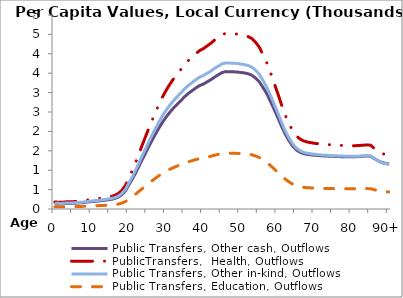
| Category | Public Transfers, Other cash, Outflows | PublicTransfers,  Health, Outflows | Public Transfers, Other in-kind, Outflows | Public Transfers, Education, Outflows |
|---|---|---|---|---|
| 0 | 139.032 | 180.778 | 150.455 | 57.532 |
|  | 134.147 | 174.426 | 145.168 | 55.51 |
| 2 | 133.057 | 173.009 | 143.989 | 55.059 |
| 3 | 141.717 | 184.269 | 153.36 | 58.643 |
| 4 | 142.704 | 185.553 | 154.428 | 59.051 |
| 5 | 146.32 | 190.254 | 158.341 | 60.547 |
| 6 | 152.817 | 198.701 | 165.372 | 63.236 |
| 7 | 159.899 | 207.911 | 173.036 | 66.167 |
| 8 | 169.314 | 220.152 | 183.224 | 70.062 |
| 9 | 182.772 | 237.651 | 197.788 | 75.631 |
| 10 | 191.481 | 248.976 | 207.213 | 79.235 |
| 11 | 200.473 | 260.667 | 216.943 | 82.956 |
| 12 | 209.949 | 272.989 | 227.198 | 86.877 |
| 13 | 220.743 | 287.023 | 238.878 | 91.344 |
| 14 | 232.007 | 301.67 | 251.069 | 96.005 |
| 15 | 246.599 | 320.643 | 266.859 | 102.043 |
| 16 | 266.409 | 346.401 | 288.296 | 110.24 |
| 17 | 302.263 | 393.02 | 327.096 | 125.077 |
| 18 | 366.175 | 476.124 | 396.259 | 151.524 |
| 19 | 466.312 | 606.328 | 504.623 | 192.961 |
| 20 | 633.241 | 817.873 | 680.684 | 260.284 |
| 21 | 794.212 | 1026.357 | 854.197 | 326.632 |
| 22 | 976.889 | 1262.941 | 1051.097 | 401.924 |
| 23 | 1174.708 | 1519.054 | 1264.25 | 483.431 |
| 24 | 1364.932 | 1765.088 | 1469.015 | 561.73 |
| 25 | 1553.705 | 2009.042 | 1672.048 | 639.367 |
| 26 | 1739.828 | 2249.276 | 1871.986 | 715.82 |
| 27 | 1915.104 | 2475.023 | 2059.867 | 787.663 |
| 28 | 2083.41 | 2691.517 | 2240.046 | 856.561 |
| 29 | 2238.52 | 2890.779 | 2405.884 | 919.975 |
| 30 | 2375.058 | 3065.386 | 2551.203 | 975.542 |
| 31 | 2498.477 | 3222.581 | 2682.03 | 1025.569 |
| 32 | 2606.732 | 3359.74 | 2796.182 | 1069.219 |
| 33 | 2705.934 | 3484.663 | 2900.151 | 1108.975 |
| 34 | 2801.962 | 3604.952 | 3000.263 | 1147.256 |
| 35 | 2900.164 | 3728.176 | 3102.818 | 1186.472 |
| 36 | 2982.546 | 3831.48 | 3188.794 | 1219.348 |
| 37 | 3051.804 | 3918.983 | 3261.619 | 1247.195 |
| 38 | 3122.511 | 4008.936 | 3336.483 | 1275.822 |
| 39 | 3182.287 | 4084.91 | 3399.714 | 1300.001 |
| 40 | 3221.468 | 4134.223 | 3440.755 | 1315.694 |
| 41 | 3276.887 | 4203.655 | 3498.54 | 1337.79 |
| 42 | 3332.328 | 4271.71 | 3555.18 | 1359.449 |
| 43 | 3399.367 | 4353.798 | 3623.499 | 1385.573 |
| 44 | 3458.143 | 4424.758 | 3682.556 | 1408.155 |
| 45 | 3516.219 | 4495.486 | 3741.42 | 1430.664 |
| 46 | 3541.426 | 4525.037 | 3766.015 | 1440.069 |
| 47 | 3537.642 | 4517.868 | 3760.048 | 1437.787 |
| 48 | 3535.555 | 4513.75 | 3756.621 | 1436.477 |
| 49 | 3531.455 | 4507.925 | 3751.773 | 1434.623 |
| 50 | 3518.347 | 4489.463 | 3736.407 | 1428.747 |
| 51 | 3507.151 | 4472.721 | 3722.474 | 1423.419 |
| 52 | 3486.69 | 4444.6 | 3699.07 | 1414.47 |
| 53 | 3450.327 | 4396.16 | 3658.755 | 1399.054 |
| 54 | 3378.037 | 4300.573 | 3579.202 | 1368.634 |
| 55 | 3284.095 | 4178.063 | 3477.242 | 1329.646 |
| 56 | 3137.094 | 3986.864 | 3318.114 | 1268.798 |
| 57 | 2980.458 | 3783.05 | 3148.487 | 1203.935 |
| 58 | 2785.856 | 3530.429 | 2938.241 | 1123.54 |
| 59 | 2576.256 | 3258.911 | 2712.266 | 1037.131 |
| 60 | 2361.724 | 2980.785 | 2480.793 | 948.619 |
| 61 | 2140.738 | 2694.319 | 2242.378 | 857.452 |
| 62 | 1932.392 | 2424.095 | 2017.481 | 771.455 |
| 63 | 1766.413 | 2207.381 | 1837.119 | 702.487 |
| 64 | 1623.246 | 2019.575 | 1680.815 | 642.719 |
| 65 | 1522.686 | 1885.749 | 1569.437 | 600.129 |
| 66 | 1462.308 | 1803.644 | 1501.104 | 574 |
| 67 | 1427.276 | 1754.733 | 1460.397 | 558.434 |
| 68 | 1407.141 | 1725.629 | 1436.175 | 549.172 |
| 69 | 1395.293 | 1707.794 | 1421.332 | 543.496 |
| 70 | 1385.25 | 1693.172 | 1409.162 | 538.843 |
| 71 | 1377.618 | 1681.723 | 1399.634 | 535.199 |
| 72 | 1370.607 | 1670.882 | 1390.611 | 531.749 |
| 73 | 1365.45 | 1663.152 | 1384.177 | 529.289 |
| 74 | 1360.64 | 1656.081 | 1378.292 | 527.039 |
| 75 | 1356.425 | 1649.932 | 1373.175 | 525.082 |
| 76 | 1353.706 | 1645.836 | 1369.766 | 523.778 |
| 77 | 1348.704 | 1638.615 | 1363.757 | 521.48 |
| 78 | 1348.441 | 1637.212 | 1362.588 | 521.034 |
| 79 | 1345.275 | 1631.809 | 1358.092 | 519.314 |
| 80 | 1344.79 | 1629.886 | 1356.492 | 518.702 |
| 81 | 1347.615 | 1632.319 | 1358.516 | 519.477 |
| 82 | 1352.438 | 1637.318 | 1362.677 | 521.068 |
| 83 | 1358.827 | 1644.336 | 1368.518 | 523.301 |
| 84 | 1366.071 | 1652.454 | 1375.274 | 525.885 |
| 85 | 1360.008 | 1643.255 | 1367.618 | 522.957 |
| 86 | 1298.675 | 1563.506 | 1301.246 | 497.577 |
| 87 | 1244.083 | 1492.523 | 1242.17 | 474.987 |
| 88 | 1197.692 | 1432.203 | 1191.967 | 455.791 |
| 89 | 1176.282 | 1404.364 | 1168.798 | 446.931 |
| 90+ | 1156.125 | 1378.154 | 1146.985 | 438.59 |